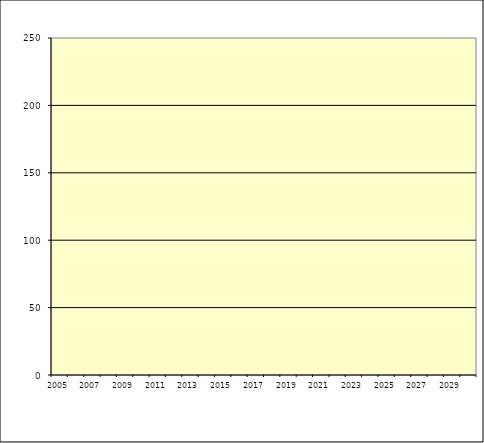
| Category | Series 0 |
|---|---|
| 2005.0 | 0 |
| 2006.0 | 0 |
| 2007.0 | 0 |
| 2008.0 | 0 |
| 2009.0 | 0 |
| 2010.0 | 0 |
| 2011.0 | 0 |
| 2012.0 | 0 |
| 2013.0 | 0 |
| 2014.0 | 0 |
| 2015.0 | 0 |
| 2016.0 | 0 |
| 2017.0 | 0 |
| 2018.0 | 0 |
| 2019.0 | 0 |
| 2020.0 | 0 |
| 2021.0 | 0 |
| 2022.0 | 0 |
| 2023.0 | 0 |
| 2024.0 | 0 |
| 2025.0 | 0 |
| 2026.0 | 0 |
| 2027.0 | 0 |
| 2028.0 | 0 |
| 2029.0 | 0 |
| 2030.0 | 0 |